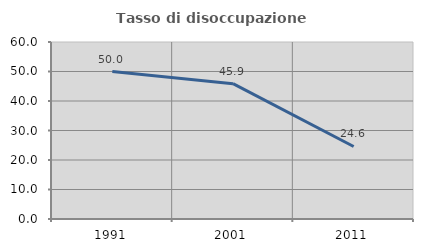
| Category | Tasso di disoccupazione giovanile  |
|---|---|
| 1991.0 | 50 |
| 2001.0 | 45.882 |
| 2011.0 | 24.59 |